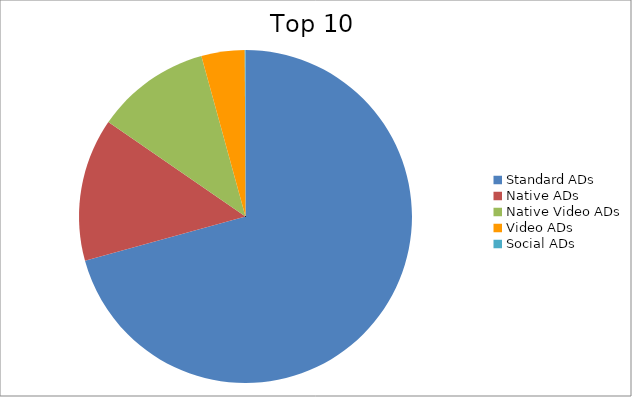
| Category | Series 0 |
|---|---|
| Standard ADs | 70.72 |
| Native ADs | 13.88 |
| Native Video ADs | 11.13 |
| Video ADs | 4.2 |
| Social ADs | 0.07 |